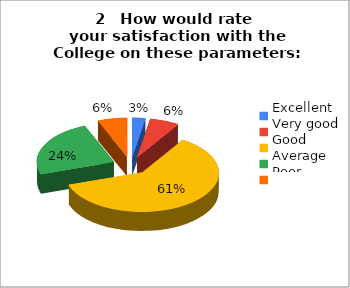
| Category | 2   How would rate 
your satisfaction with the College on these parameters:         [Faculty] |
|---|---|
| Excellent | 4 |
| Very good | 9 |
| Good | 89 |
| Average | 35 |
| Poor | 9 |